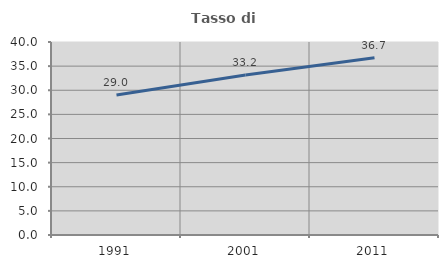
| Category | Tasso di occupazione   |
|---|---|
| 1991.0 | 28.999 |
| 2001.0 | 33.183 |
| 2011.0 | 36.725 |